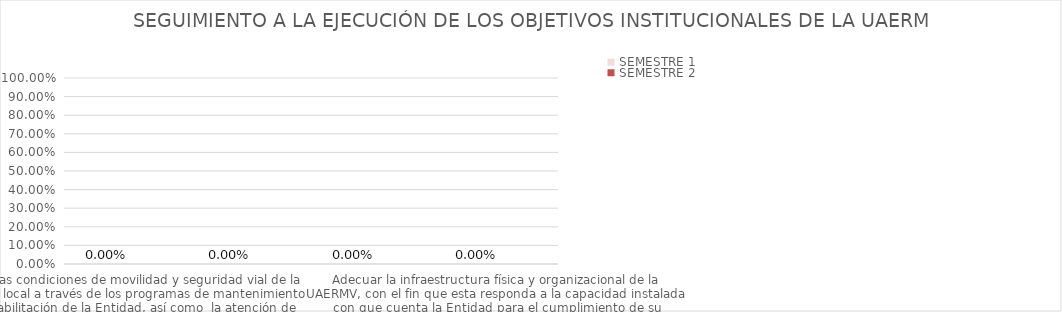
| Category | SEMESTRE 1 | SEMESTRE 2 |
|---|---|---|
| Mejorar las condiciones de movilidad y seguridad vial de la malla vial local a través de los programas de mantenimiento y/o rehabilitación de la Entidad, así como  la atención de situaciones imprevistas que impidan la movilidad en el Distrito Capital | 0 |  |
| Mejorar la gestión y que-hacer institucional de la Entidad a través de la implementación de acciones que promuevan la transparencia, el fortalecimiento del servicio al ciudadano y partes interesadas, así como la eficiencia de los procesos y procedimientos. | 0 |  |
| Integrar la gestión de la información  normalizada, asertiva y oportuna,  acorde con el plan estratégico y visión de entidad con el propósito de generar confianza para la toma de decisiones y soporte para las diferentes políticas del Distrito. | 0 |  |
| Adecuar la infraestructura física y organizacional de la UAERMV, con el fin que esta responda a la capacidad instalada con que cuenta la Entidad para el cumplimiento de su misionalidad. | 0 |  |